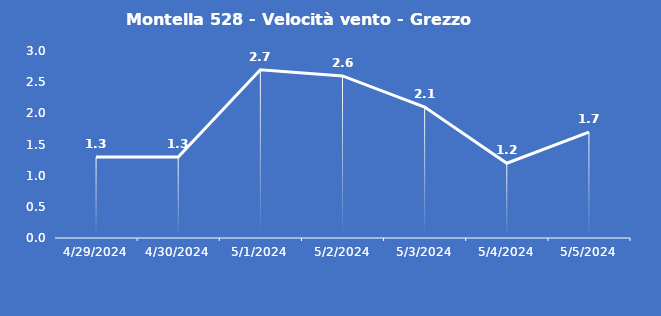
| Category | Montella 528 - Velocità vento - Grezzo (m/s) |
|---|---|
| 4/29/24 | 1.3 |
| 4/30/24 | 1.3 |
| 5/1/24 | 2.7 |
| 5/2/24 | 2.6 |
| 5/3/24 | 2.1 |
| 5/4/24 | 1.2 |
| 5/5/24 | 1.7 |